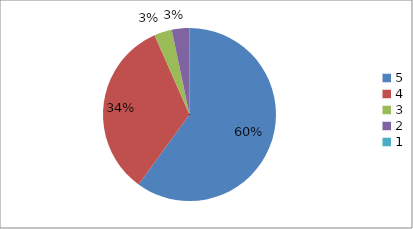
| Category | Series 0 | Series 1 |
|---|---|---|
| 5.0 | 58.1 | 58.1 |
| 4.0 | 32.3 | 32.3 |
| 3.0 | 3.2 | 3.2 |
| 2.0 | 3.2 | 3.2 |
| 1.0 | 0 | 0 |